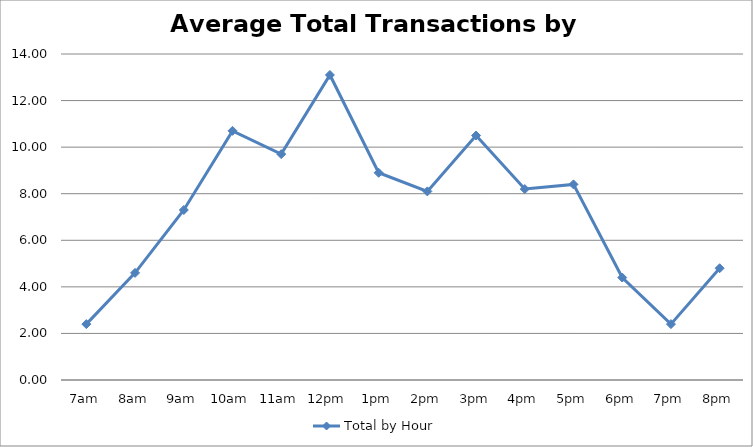
| Category | Total by Hour |
|---|---|
| 7am | 2.4 |
| 8am | 4.6 |
| 9am | 7.3 |
| 10am | 10.7 |
| 11am | 9.7 |
| 12pm | 13.1 |
| 1pm | 8.9 |
| 2pm | 8.1 |
| 3pm | 10.5 |
| 4pm | 8.2 |
| 5pm | 8.4 |
| 6pm | 4.4 |
| 7pm | 2.4 |
| 8pm | 4.8 |